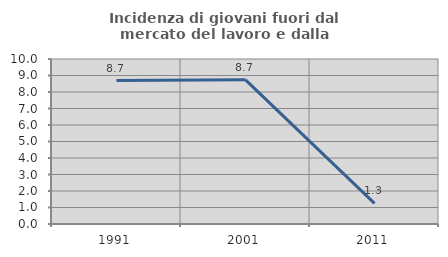
| Category | Incidenza di giovani fuori dal mercato del lavoro e dalla formazione  |
|---|---|
| 1991.0 | 8.696 |
| 2001.0 | 8.738 |
| 2011.0 | 1.25 |